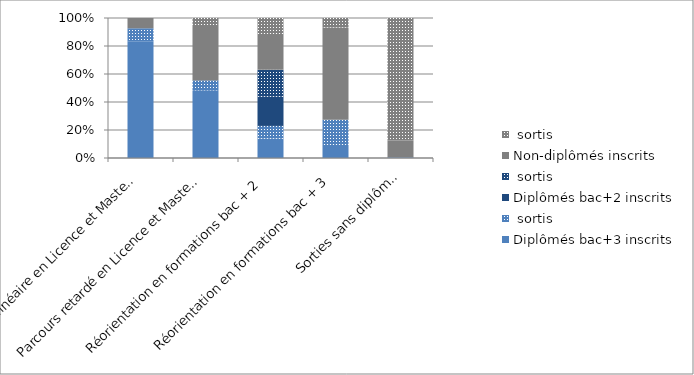
| Category | Diplômés bac+3 inscrits | Diplômés bac+3 sortis | Diplômés bac+2 inscrits | Diplômés bac+2 sortis | Non-diplômés inscrits | Non-diplômés sortis |
|---|---|---|---|---|---|---|
| Parcours linéaire en Licence et Master  | 0.83 | 0.096 | 0 | 0 | 0.073 | 0 |
| Parcours retardé en Licence et Master  | 0.483 | 0.071 | 0 | 0 | 0.396 | 0.05 |
| Réorientation en formations bac + 2  | 0.138 | 0.091 | 0.209 | 0.192 | 0.256 | 0.114 |
| Réorientation en formations bac + 3 | 0.094 | 0.179 | 0 | 0 | 0.659 | 0.068 |
| Sorties sans diplôme  | 0.005 | 0 | 0 | 0 | 0.122 | 0.874 |